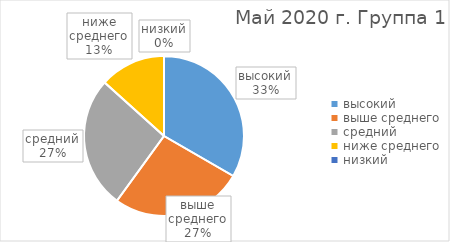
| Category | Series 0 |
|---|---|
| высокий | 5 |
| выше среднего | 4 |
| средний | 4 |
| ниже среднего | 2 |
| низкий | 0 |